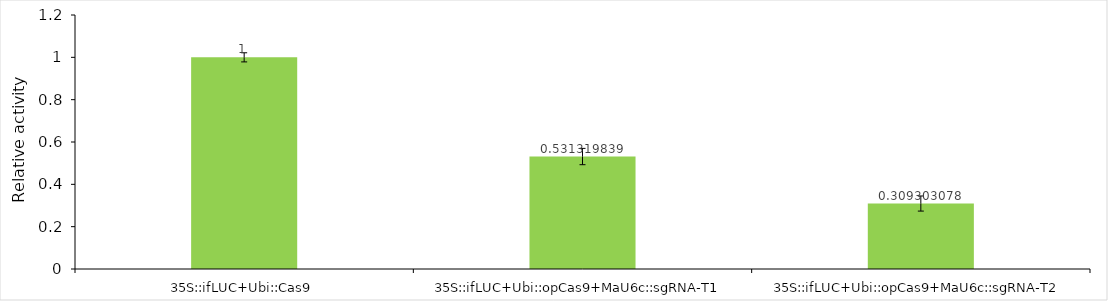
| Category | Series 0 |
|---|---|
| 35S::ifLUC+Ubi::Cas9 | 1 |
| 35S::ifLUC+Ubi::opCas9+MaU6c::sgRNA-T1 | 0.531 |
| 35S::ifLUC+Ubi::opCas9+MaU6c::sgRNA-T2 | 0.309 |